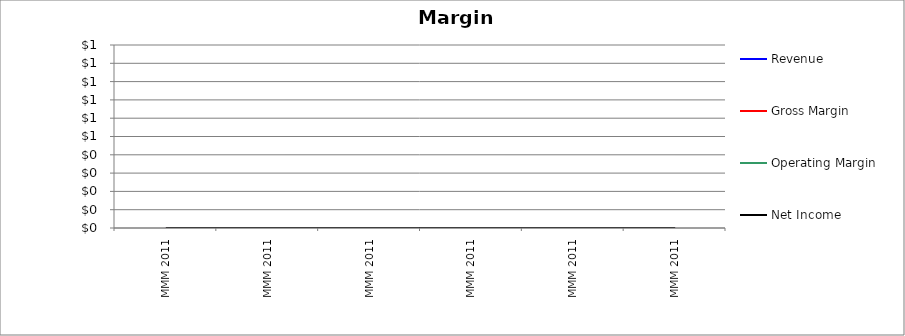
| Category | Revenue | Gross Margin | Operating Margin | Net Income |
|---|---|---|---|---|
| MMM 2011 | 0 | 0 | 0 | 0 |
| MMM 2011 | 0 | 0 | 0 | 0 |
| MMM 2011 | 0 | 0 | 0 | 0 |
| MMM 2011 | 0 | 0 | 0 | 0 |
| MMM 2011 | 0 | 0 | 0 | 0 |
| MMM 2011 | 0 | 0 | 0 | 0 |